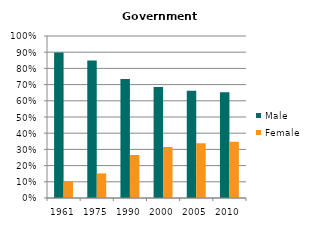
| Category | Male | Female |
|---|---|---|
| 1961.0 | 0.898 | 0.102 |
| 1975.0 | 0.848 | 0.152 |
| 1990.0 | 0.734 | 0.266 |
| 2000.0 | 0.685 | 0.315 |
| 2005.0 | 0.662 | 0.338 |
| 2010.0 | 0.653 | 0.347 |